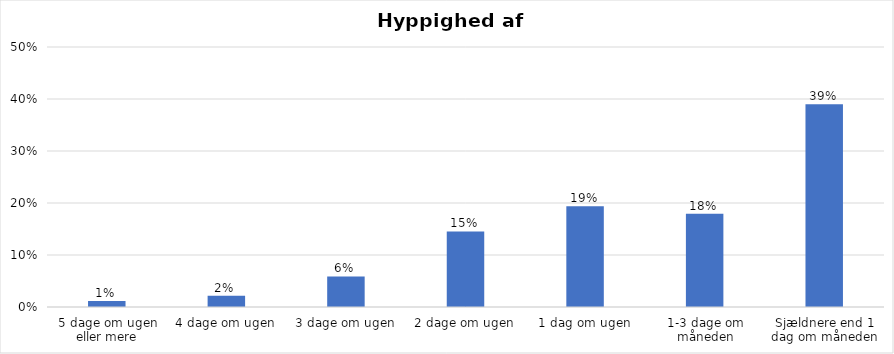
| Category | % |
|---|---|
| 5 dage om ugen eller mere | 0.012 |
| 4 dage om ugen | 0.021 |
| 3 dage om ugen | 0.059 |
| 2 dage om ugen | 0.145 |
| 1 dag om ugen | 0.194 |
| 1-3 dage om måneden | 0.179 |
| Sjældnere end 1 dag om måneden | 0.39 |